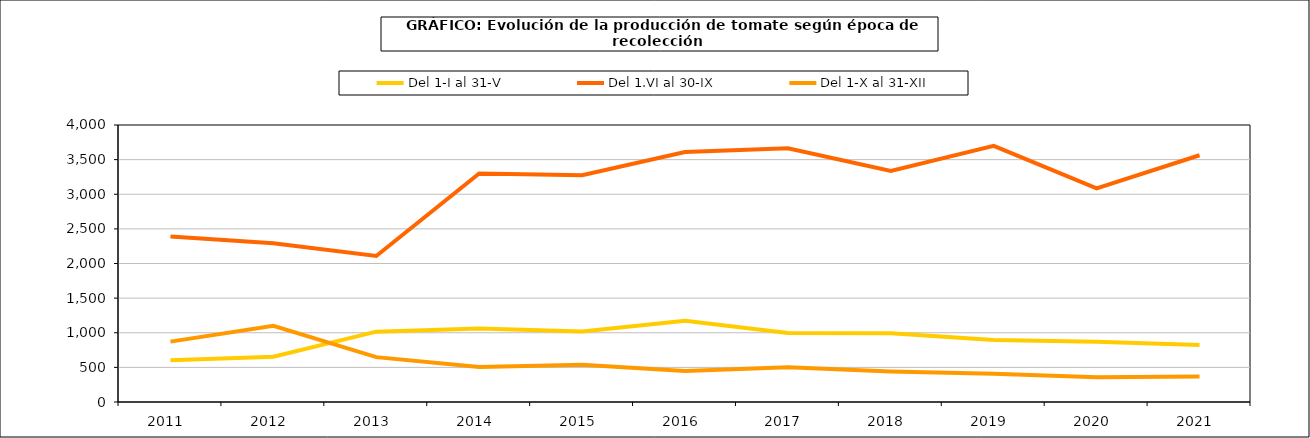
| Category | Del 1-I al 31-V | Del 1.VI al 30-IX | Del 1-X al 31-XII |
|---|---|---|---|
| 2011.0 | 603.266 | 2389.177 | 871.679 |
| 2012.0 | 652.744 | 2292.602 | 1101.067 |
| 2013.0 | 1015.956 | 2108.99 | 647.9 |
| 2014.0 | 1061.306 | 3300.096 | 504.058 |
| 2015.0 | 1017.886 | 3275.48 | 539.334 |
| 2016.0 | 1174.446 | 3611.158 | 447.938 |
| 2017.0 | 995.505 | 3664.966 | 502.995 |
| 2018.0 | 991.845 | 3336.107 | 440.643 |
| 2019.0 | 894.568 | 3698.699 | 407.292 |
| 2020.0 | 870.627 | 3084.921 | 357.347 |
| 2021.0 | 823.93 | 3562.768 | 367.682 |